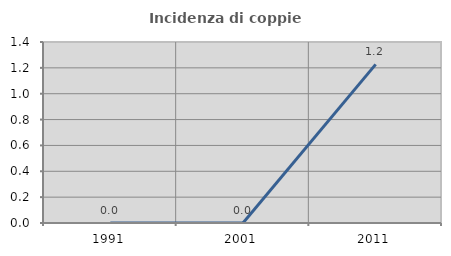
| Category | Incidenza di coppie miste |
|---|---|
| 1991.0 | 0 |
| 2001.0 | 0 |
| 2011.0 | 1.227 |